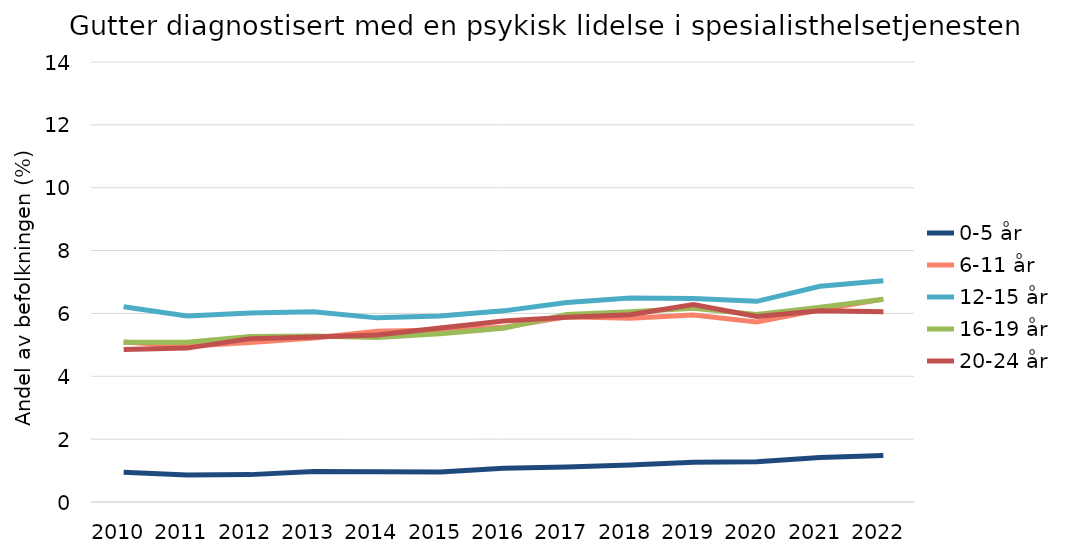
| Category | 0-5 år | 6-11 år | 12-15 år | 16-19 år | 20-24 år |
|---|---|---|---|---|---|
| 2010.0 | 0.946 | 5.093 | 6.212 | 5.085 | 4.853 |
| 2011.0 | 0.859 | 4.952 | 5.922 | 5.085 | 4.897 |
| 2012.0 | 0.871 | 5.071 | 6.015 | 5.268 | 5.198 |
| 2013.0 | 0.972 | 5.22 | 6.05 | 5.284 | 5.253 |
| 2014.0 | 0.964 | 5.435 | 5.859 | 5.233 | 5.315 |
| 2015.0 | 0.954 | 5.471 | 5.92 | 5.353 | 5.538 |
| 2016.0 | 1.074 | 5.557 | 6.082 | 5.528 | 5.759 |
| 2017.0 | 1.112 | 5.892 | 6.345 | 5.968 | 5.877 |
| 2018.0 | 1.178 | 5.846 | 6.494 | 6.057 | 5.959 |
| 2019.0 | 1.265 | 5.951 | 6.475 | 6.167 | 6.282 |
| 2020.0 | 1.28 | 5.725 | 6.384 | 5.963 | 5.903 |
| 2021.0 | 1.413 | 6.116 | 6.867 | 6.194 | 6.082 |
| 2022.0 | 1.479 | 6.456 | 7.038 | 6.449 | 6.053 |